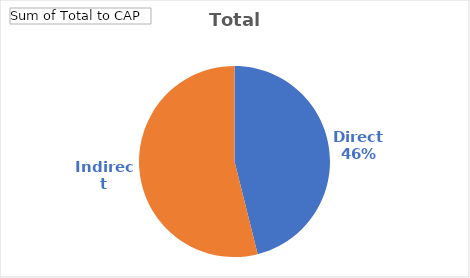
| Category | Total |
|---|---|
| Direct | 10962123.6 |
| Indirect | 12821167 |